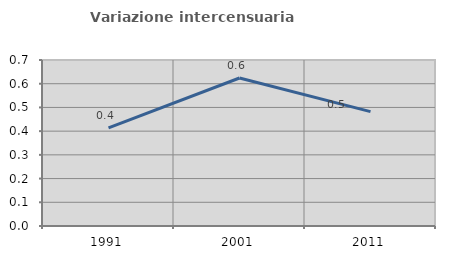
| Category | Variazione intercensuaria annua |
|---|---|
| 1991.0 | 0.413 |
| 2001.0 | 0.624 |
| 2011.0 | 0.482 |